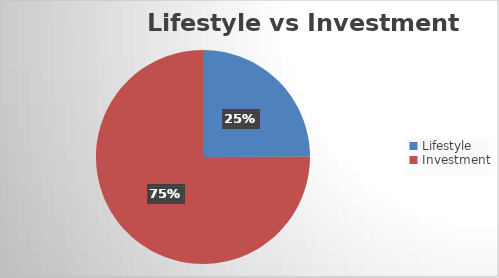
| Category | Series 0 |
|---|---|
| Lifestyle | 0.25 |
| Investment | 0.75 |